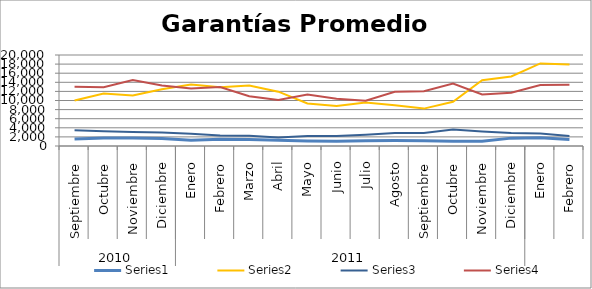
| Category | Series 0 | Series 1 | Series 2 | Series 3 |
|---|---|---|---|---|
| 0 | 1528.048 | 9989.528 | 3482.397 | 13040.893 |
| 1 | 1765.671 | 11522.563 | 3249.678 | 12931.878 |
| 2 | 1744.818 | 11123.372 | 3083.204 | 14519.409 |
| 3 | 1659.203 | 12493.623 | 2971.808 | 13273.812 |
| 4 | 1282.931 | 13511.197 | 2715.795 | 12631.271 |
| 5 | 1469.886 | 12912.935 | 2313.398 | 12967.84 |
| 6 | 1451.049 | 13292.147 | 2234.5 | 10944.124 |
| 7 | 1243.266 | 11940.059 | 1876.192 | 10106.188 |
| 8 | 1094.477 | 9346.935 | 2211.516 | 11309.35 |
| 9 | 1038.181 | 8772.488 | 2185.859 | 10360.845 |
| 10 | 1150.33 | 9583.522 | 2484.933 | 9954.534 |
| 11 | 1204.945 | 8947.225 | 2874.347 | 11912.953 |
| 12 | 1181.135 | 8218.837 | 2868.226 | 12046.458 |
| 13 | 1047.181 | 9725.758 | 3619.145 | 13704.352 |
| 14 | 1067.214 | 14456.861 | 3177.175 | 11327.495 |
| 15 | 1729.716 | 15271.717 | 2830.669 | 11719.895 |
| 16 | 1828.564 | 18155.583 | 2744.93 | 13413.991 |
| 17 | 1451.155 | 17917.734 | 2215.902 | 13440.832 |